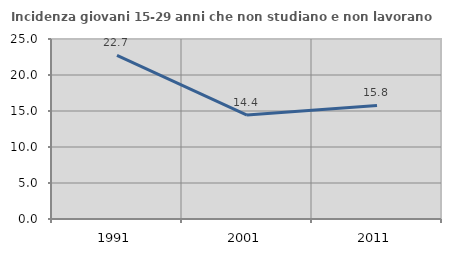
| Category | Incidenza giovani 15-29 anni che non studiano e non lavorano  |
|---|---|
| 1991.0 | 22.727 |
| 2001.0 | 14.432 |
| 2011.0 | 15.771 |